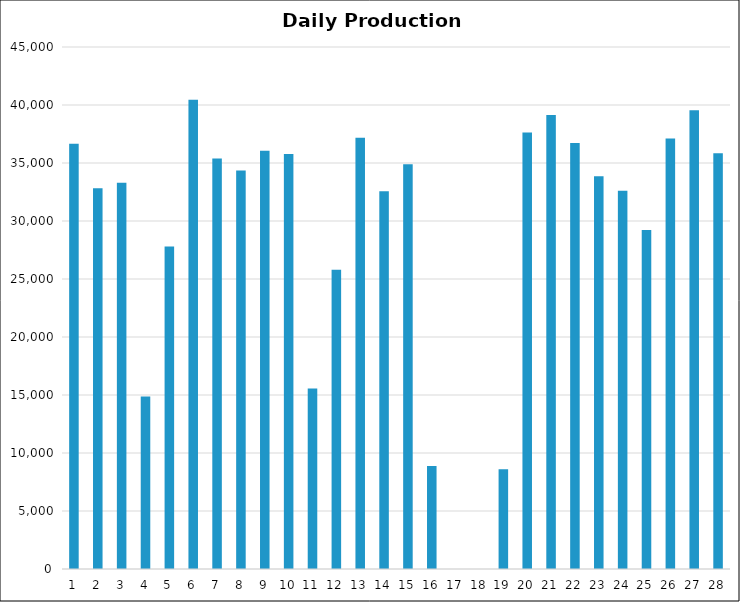
| Category | Series 0 |
|---|---|
| 0 | 36666.75 |
| 1 | 32832.75 |
| 2 | 33293.75 |
| 3 | 14864.25 |
| 4 | 27795.25 |
| 5 | 40461.25 |
| 6 | 35386.5 |
| 7 | 34346.25 |
| 8 | 36059.75 |
| 9 | 35780.5 |
| 10 | 15564.5 |
| 11 | 25793 |
| 12 | 37171.75 |
| 13 | 32566 |
| 14 | 34899.25 |
| 15 | 8878 |
| 16 | 0 |
| 17 | 0 |
| 18 | 8600.25 |
| 19 | 37634.5 |
| 20 | 39138.75 |
| 21 | 36715 |
| 22 | 33855.5 |
| 23 | 32611 |
| 24 | 29221 |
| 25 | 37120.75 |
| 26 | 39541.5 |
| 27 | 35850.75 |